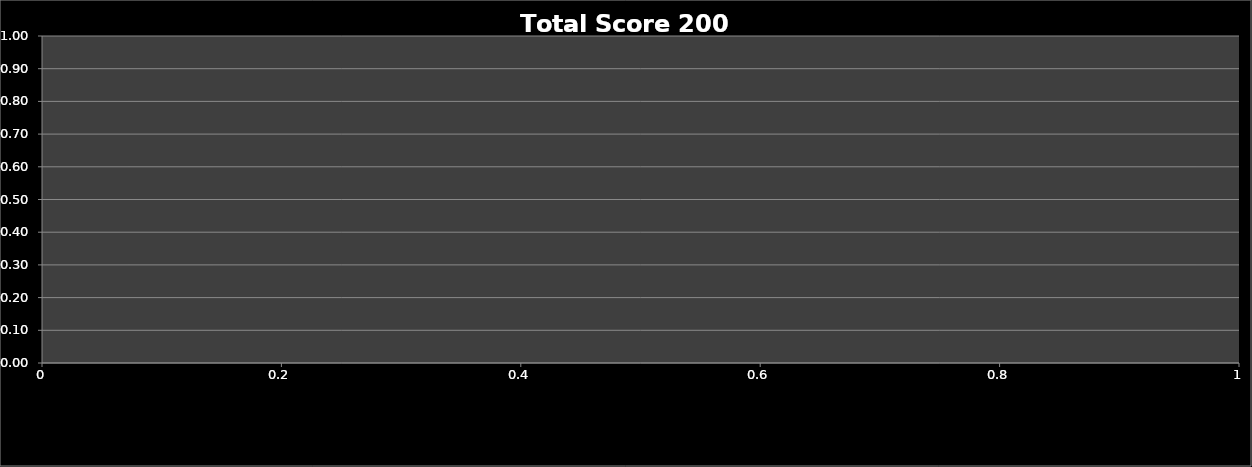
| Category | Total Score 200 MAX |
|---|---|
| 0 | 0 |
| 1 | 0 |
| 2 | 0 |
| 3 | 0 |
| 4 | 0 |
| 5 | 0 |
| 6 | 0 |
| 7 | 0 |
| 8 | 0 |
| 9 | 0 |
| 10 | 0 |
| 11 | 0 |
| 12 | 0 |
| 13 | 0 |
| 14 | 0 |
| 15 | 0 |
| 16 | 0 |
| 17 | 0 |
| 18 | 0 |
| 19 | 0 |
| 20 | 0 |
| 21 | 0 |
| 22 | 0 |
| 23 | 0 |
| 24 | 0 |
| 25 | 0 |
| 26 | 0 |
| 27 | 0 |
| 28 | 0 |
| 29 | 0 |
| 30 | 0 |
| 31 | 0 |
| 32 | 0 |
| 33 | 0 |
| 34 | 0 |
| 35 | 0 |